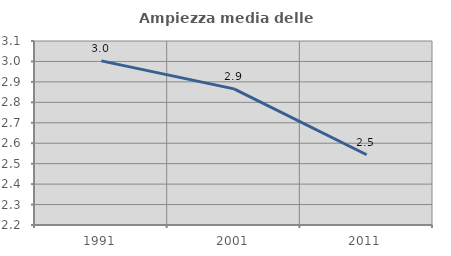
| Category | Ampiezza media delle famiglie |
|---|---|
| 1991.0 | 3.003 |
| 2001.0 | 2.866 |
| 2011.0 | 2.544 |